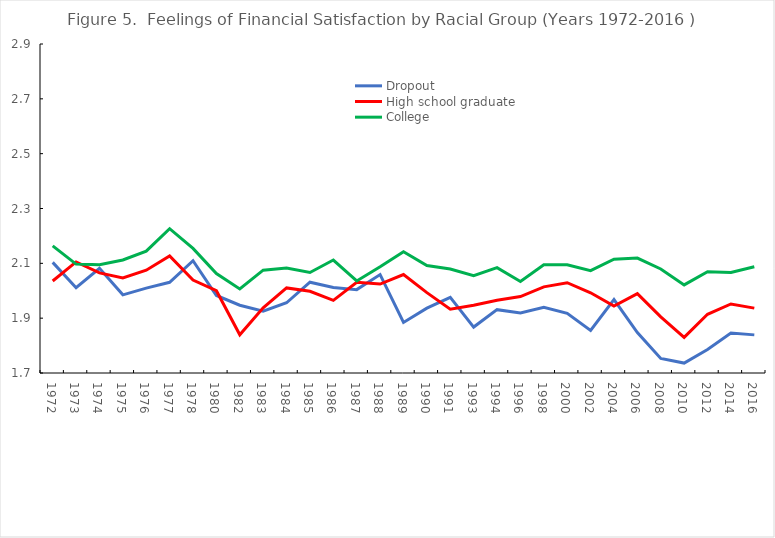
| Category | Dropout | High school graduate | College |
|---|---|---|---|
| 1972.0 | 2.103 | 2.036 | 2.164 |
| 1973.0 | 2.011 | 2.105 | 2.097 |
| 1974.0 | 2.082 | 2.065 | 2.095 |
| 1975.0 | 1.985 | 2.046 | 2.112 |
| 1976.0 | 2.009 | 2.075 | 2.144 |
| 1977.0 | 2.031 | 2.127 | 2.226 |
| 1978.0 | 2.11 | 2.039 | 2.155 |
| 1980.0 | 1.983 | 2 | 2.063 |
| 1982.0 | 1.947 | 1.839 | 2.006 |
| 1983.0 | 1.926 | 1.938 | 2.075 |
| 1984.0 | 1.956 | 2.01 | 2.083 |
| 1985.0 | 2.031 | 1.998 | 2.067 |
| 1986.0 | 2.012 | 1.965 | 2.112 |
| 1987.0 | 2.004 | 2.031 | 2.036 |
| 1988.0 | 2.059 | 2.024 | 2.087 |
| 1989.0 | 1.885 | 2.059 | 2.142 |
| 1990.0 | 1.937 | 1.993 | 2.092 |
| 1991.0 | 1.976 | 1.933 | 2.079 |
| 1993.0 | 1.868 | 1.947 | 2.055 |
| 1994.0 | 1.931 | 1.965 | 2.084 |
| 1996.0 | 1.919 | 1.979 | 2.034 |
| 1998.0 | 1.94 | 2.014 | 2.094 |
| 2000.0 | 1.918 | 2.029 | 2.095 |
| 2002.0 | 1.855 | 1.993 | 2.073 |
| 2004.0 | 1.968 | 1.944 | 2.115 |
| 2006.0 | 1.848 | 1.989 | 2.119 |
| 2008.0 | 1.753 | 1.905 | 2.08 |
| 2010.0 | 1.736 | 1.83 | 2.021 |
| 2012.0 | 1.785 | 1.914 | 2.069 |
| 2014.0 | 1.846 | 1.952 | 2.066 |
| 2016.0 | 1.839 | 1.937 | 2.087 |